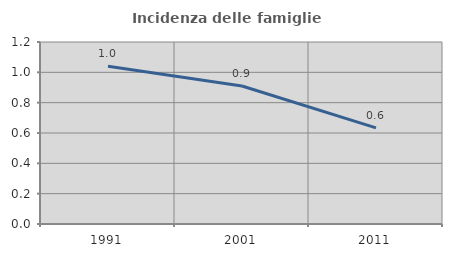
| Category | Incidenza delle famiglie numerose |
|---|---|
| 1991.0 | 1.04 |
| 2001.0 | 0.91 |
| 2011.0 | 0.634 |